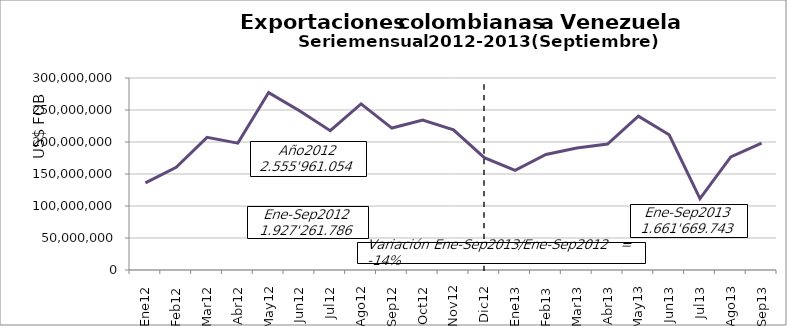
| Category | Series 0 |
|---|---|
| 0 | 136240123.27 |
| 1 | 160459411.38 |
| 2 | 207247267.85 |
| 3 | 198217135.09 |
| 4 | 277200446.23 |
| 5 | 248825838.8 |
| 6 | 217706786.3 |
| 7 | 259592610.31 |
| 8 | 221772166.41 |
| 9 | 234248364.59 |
| 10 | 218944105.2 |
| 11 | 175506798.26 |
| 12 | 155736279.23 |
| 13 | 180463773.91 |
| 14 | 190645780.63 |
| 15 | 196845061.13 |
| 16 | 240279208.48 |
| 17 | 211274355.75 |
| 18 | 111599749.49 |
| 19 | 176719546.07 |
| 20 | 198105987.86 |